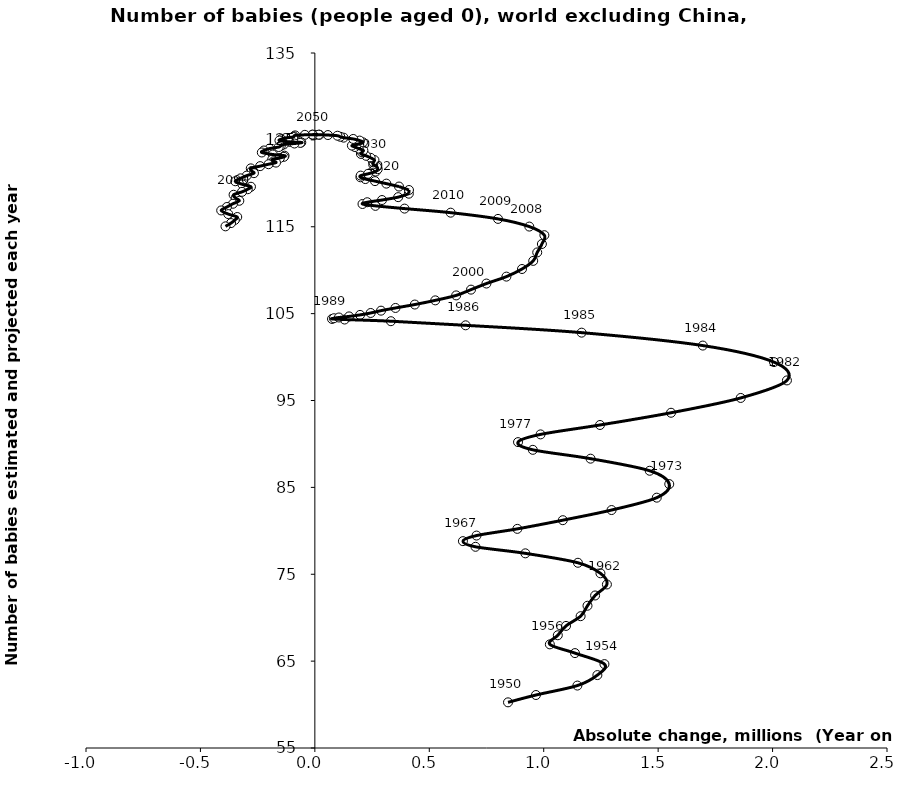
| Category | Series 0 |
|---|---|
| 0.8439989999999966 | 60.256 |
| 0.9660464999999974 | 61.1 |
| 1.1471005000000005 | 62.188 |
| 1.2344969999999904 | 63.394 |
| 1.265357999999999 | 64.657 |
| 1.136525000000006 | 65.924 |
| 1.0268635000000046 | 66.93 |
| 1.0615925000000033 | 67.978 |
| 1.0975019999999915 | 69.053 |
| 1.1612640000000027 | 70.173 |
| 1.1913289999999535 | 71.375 |
| 1.224530499999993 | 72.556 |
| 1.2761340000000487 | 73.824 |
| 1.2479104999999961 | 75.108 |
| 1.149506500000001 | 76.32 |
| 0.9197690000000094 | 77.407 |
| 0.7019419999999954 | 78.16 |
| 0.6469564999999946 | 78.811 |
| 0.7064544999999995 | 79.454 |
| 0.884667499999999 | 80.224 |
| 1.0834455000000034 | 81.223 |
| 1.2964455000000044 | 82.391 |
| 1.4939605 | 83.816 |
| 1.5485745000000009 | 85.379 |
| 1.4630239999999972 | 86.913 |
| 1.2047094999999999 | 88.305 |
| 0.9523909999999987 | 89.322 |
| 0.8877939999999995 | 90.21 |
| 0.9861605000000111 | 91.098 |
| 1.245922499999999 | 92.182 |
| 1.5563319999999976 | 93.59 |
| 1.8608019999999996 | 95.295 |
| 2.062755000000003 | 97.312 |
| 2.0060234999999977 | 99.42 |
| 1.6951244999999915 | 101.324 |
| 1.1656665000000004 | 102.81 |
| 0.6587434999999928 | 103.655 |
| 0.33224000000000586 | 104.128 |
| 0.1300275000000113 | 104.319 |
| 0.07492199999999372 | 104.388 |
| 0.08329549999999841 | 104.469 |
| 0.10513000000000261 | 104.554 |
| 0.14950699999999983 | 104.679 |
| 0.19750549999999834 | 104.853 |
| 0.24392850000000266 | 105.074 |
| 0.2891274999999993 | 105.341 |
| 0.352268500000001 | 105.653 |
| 0.4367390000000029 | 106.046 |
| 0.5261159999999947 | 106.526 |
| 0.617456500000003 | 107.098 |
| 0.682262999999999 | 107.761 |
| 0.749669499999996 | 108.463 |
| 0.8370435000000072 | 109.26 |
| 0.905183000000001 | 110.137 |
| 0.9541114999999891 | 111.071 |
| 0.971705 | 112.045 |
| 0.9920105000000063 | 113.014 |
| 1.0028920000000028 | 114.029 |
| 0.9370099999999937 | 115.02 |
| 0.8003509999999991 | 115.903 |
| 0.5933930000000132 | 116.621 |
| 0.3918885000000074 | 117.09 |
| 0.26465399999999306 | 117.405 |
| 0.20818049999999033 | 117.619 |
| 0.2288235000000114 | 117.821 |
| 0.2934294999999949 | 118.077 |
| 0.3640284999999821 | 118.408 |
| 0.41061750000000075 | 118.805 |
| 0.41126900000001143 | 119.229 |
| 0.3677240000000097 | 119.627 |
| 0.31241750000000224 | 119.964 |
| 0.26273349999999596 | 120.252 |
| 0.22060399999999447 | 120.49 |
| 0.19908000000000925 | 120.693 |
| 0.2002224999999953 | 120.888 |
| 0.23264549999998962 | 121.094 |
| 0.266187500000008 | 121.353 |
| 0.2746075000000019 | 121.626 |
| 0.27102549999999326 | 121.903 |
| 0.25491449999998395 | 122.168 |
| 0.2560059999999922 | 122.412 |
| 0.2604285000000246 | 122.68 |
| 0.2438265000000044 | 122.933 |
| 0.22388599999997894 | 123.168 |
| 0.20135199999999998 | 123.381 |
| 0.20601050000000498 | 123.571 |
| 0.21196949999999504 | 123.793 |
| 0.19187750000001103 | 123.994 |
| 0.1750445000000127 | 124.177 |
| 0.1618700000000075 | 124.345 |
| 0.1854459999999989 | 124.501 |
| 0.21040449999998856 | 124.715 |
| 0.19570050000000094 | 124.921 |
| 0.16762300000001318 | 125.107 |
| 0.12572850000000102 | 125.257 |
| 0.11106549999999515 | 125.358 |
| 0.0987544999999983 | 125.479 |
| 0.057074999999997544 | 125.556 |
| 0.02023149999998708 | 125.593 |
| -0.011179500000004339 | 125.596 |
| 0.0013605000000112 | 125.571 |
| 0.01703950000000276 | 125.599 |
| -0.009339500000002943 | 125.605 |
| -0.043737499999998875 | 125.58 |
| -0.08597100000000069 | 125.517 |
| -0.09211050000000398 | 125.408 |
| -0.09439049999999582 | 125.333 |
| -0.12686750000000302 | 125.22 |
| -0.1466984999999994 | 125.079 |
| -0.15468249999999983 | 124.926 |
| -0.10900350000000003 | 124.77 |
| -0.059271500000001254 | 124.708 |
| -0.06366000000000582 | 124.651 |
| -0.08922199999999947 | 124.581 |
| -0.13568199999998853 | 124.473 |
| -0.14896199999999737 | 124.31 |
| -0.15794050000000226 | 124.175 |
| -0.19826899999999625 | 123.994 |
| -0.22284700000000157 | 123.778 |
| -0.23175800000001345 | 123.548 |
| -0.183625499999998 | 123.315 |
| -0.13235800000000353 | 123.181 |
| -0.13517199999999718 | 123.05 |
| -0.15299299999998794 | 122.91 |
| -0.18641550000000962 | 122.744 |
| -0.18062849999999742 | 122.538 |
| -0.16983949999999481 | 122.383 |
| -0.20232650000000518 | 122.198 |
| -0.23909150000000068 | 121.978 |
| -0.28003100000000103 | 121.72 |
| -0.2756224999999972 | 121.418 |
| -0.2661909999999921 | 121.168 |
| -0.2976420000000033 | 120.886 |
| -0.3248195000000038 | 120.573 |
| -0.34771349999999757 | 120.236 |
| -0.31651900000000666 | 119.878 |
| -0.2792090000000087 | 119.603 |
| -0.29316599999999937 | 119.319 |
| -0.3183179999999979 | 119.017 |
| -0.3551324999999963 | 118.683 |
| -0.3459904999999992 | 118.306 |
| -0.3300424999999976 | 117.991 |
| -0.35792949999999735 | 117.646 |
| -0.38434600000000785 | 117.275 |
| -0.4092600000000033 | 116.878 |
| -0.378248499999998 | 116.456 |
| -0.3391445000000033 | 116.121 |
| -0.349694999999997 | 115.778 |
| -0.36608149999999995 | 115.422 |
| -0.3905604999999994 | 115.046 |